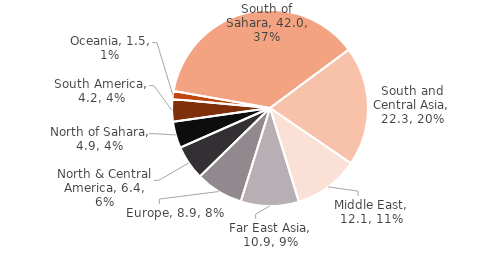
| Category | Series 0 |
|---|---|
| South of Sahara | 41.989 |
| South and Central Asia | 22.298 |
| Middle East | 12.118 |
| Far East Asia | 10.857 |
| Europe | 8.918 |
| North & Central America | 6.444 |
| North of Sahara | 4.934 |
| South America | 4.199 |
| Oceania | 1.505 |